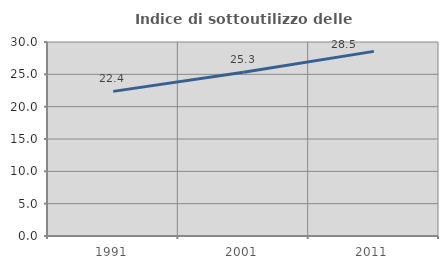
| Category | Indice di sottoutilizzo delle abitazioni  |
|---|---|
| 1991.0 | 22.365 |
| 2001.0 | 25.306 |
| 2011.0 | 28.548 |